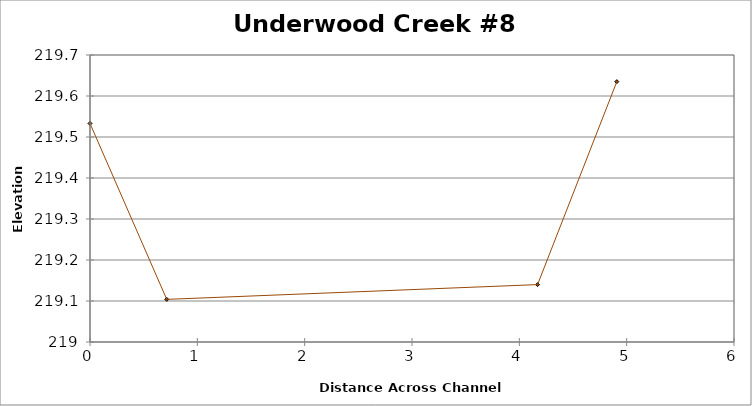
| Category | Series 0 |
|---|---|
| 0.0 | 219.533 |
| 0.7151573255362262 | 219.104 |
| 4.169900718762259 | 219.14 |
| 4.90834065675355 | 219.635 |